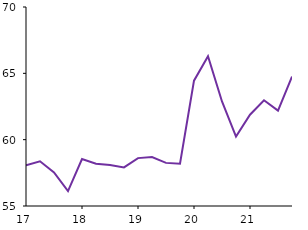
| Category | Series 0 |
|---|---|
| 2017-01-01 | 58.067 |
| 2017-04-01 | 58.369 |
| 2017-07-01 | 57.531 |
| 2017-10-01 | 56.122 |
| 2018-01-01 | 58.54 |
| 2018-04-01 | 58.191 |
| 2018-07-01 | 58.089 |
| 2018-10-01 | 57.906 |
| 2019-01-01 | 58.61 |
| 2019-04-01 | 58.686 |
| 2019-07-01 | 58.25 |
| 2019-10-01 | 58.184 |
| 2020-01-01 | 64.444 |
| 2020-04-01 | 66.295 |
| 2020-07-01 | 62.878 |
| 2020-10-01 | 60.233 |
| 2021-01-01 | 61.881 |
| 2021-04-01 | 62.968 |
| 2021-07-01 | 62.185 |
| 2021-10-01 | 64.756 |